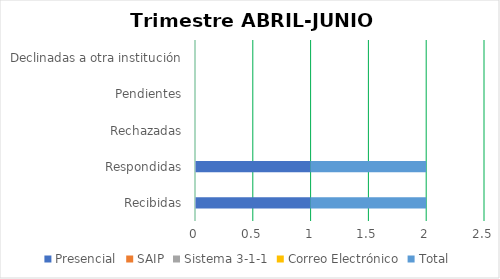
| Category | Presencial | SAIP | Sistema 3-1-1 | Correo Electrónico | Total |
|---|---|---|---|---|---|
| Recibidas | 1 | 0 | 0 | 0 | 1 |
| Respondidas | 1 | 0 | 0 | 0 | 1 |
| Rechazadas | 0 | 0 | 0 | 0 | 0 |
| Pendientes | 0 | 0 | 0 | 0 | 0 |
| Declinadas a otra institución | 0 | 0 | 0 | 0 | 0 |